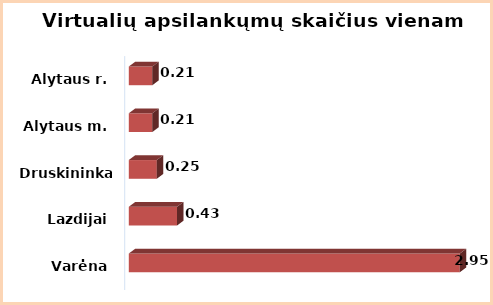
| Category | Series 0 |
|---|---|
| Varėna | 2.95 |
| Lazdijai | 0.43 |
| Druskininkai  | 0.25 |
| Alytaus m. | 0.21 |
| Alytaus r. | 0.21 |